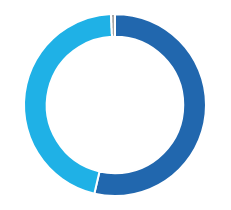
| Category | Series 0 |
|---|---|
| ● Green, Social and Sustainability bonds | 0.537 |
| ● Impact private equity | 0.457 |
| ● Impact infrastructure private debt | 0.007 |